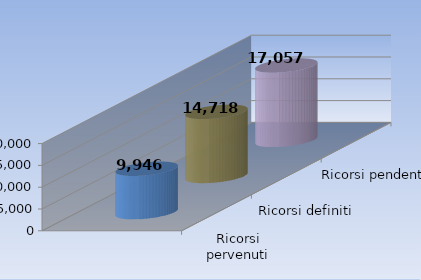
| Category | Ricorsi pervenuti | Ricorsi definiti | Ricorsi pendenti |
|---|---|---|---|
| 0 | 9946 | 14718 | 17057 |